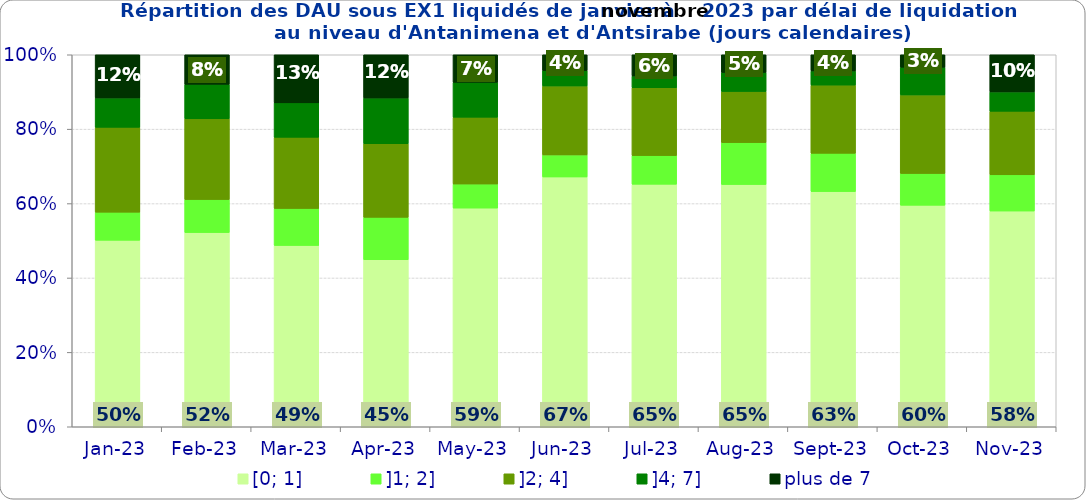
| Category | [0; 1] | ]1; 2] | ]2; 4] | ]4; 7] | plus de 7 |
|---|---|---|---|---|---|
| 2023-01-01 | 0.501 | 0.076 | 0.228 | 0.079 | 0.116 |
| 2023-02-01 | 0.522 | 0.089 | 0.217 | 0.093 | 0.08 |
| 2023-03-01 | 0.487 | 0.1 | 0.191 | 0.092 | 0.129 |
| 2023-04-01 | 0.449 | 0.114 | 0.198 | 0.123 | 0.116 |
| 2023-05-01 | 0.588 | 0.065 | 0.18 | 0.094 | 0.074 |
| 2023-06-01 | 0.672 | 0.059 | 0.185 | 0.041 | 0.043 |
| 2023-07-01 | 0.652 | 0.077 | 0.182 | 0.032 | 0.057 |
| 2023-08-01 | 0.651 | 0.113 | 0.137 | 0.051 | 0.048 |
| 2023-09-01 | 0.632 | 0.103 | 0.183 | 0.038 | 0.044 |
| 2023-10-01 | 0.595 | 0.086 | 0.211 | 0.075 | 0.033 |
| 2023-11-01 | 0.58 | 0.097 | 0.171 | 0.052 | 0.1 |